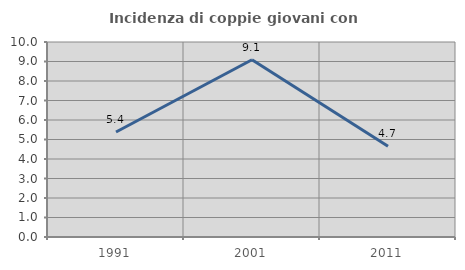
| Category | Incidenza di coppie giovani con figli |
|---|---|
| 1991.0 | 5.385 |
| 2001.0 | 9.091 |
| 2011.0 | 4.651 |